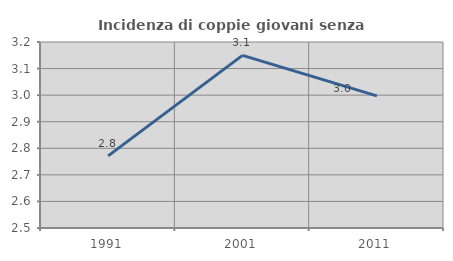
| Category | Incidenza di coppie giovani senza figli |
|---|---|
| 1991.0 | 2.771 |
| 2001.0 | 3.15 |
| 2011.0 | 2.997 |